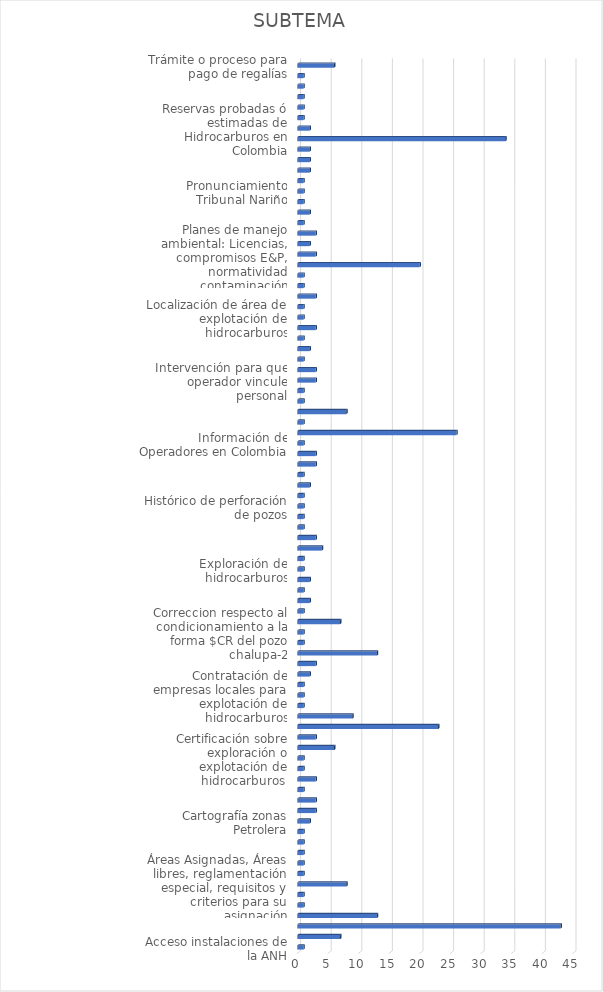
| Category | CANTIDAD |
|---|---|
| Acceso instalaciones de la ANH | 1 |
| Aclaración sobre los TEAs, E&P, Bloques | 7 |
| Acompañamiento a comunidad en desarrollo de proyecto (ambiental, social) | 43 |
| Actividad Hidrocarburífera en regiones del país | 13 |
| Adjudicación de predios baldíos | 1 |
| Archivo tipo shape | 1 |
| Áreas Asignadas, Áreas libres, reglamentación especial, requisitos y criterios para su asignación | 8 |
| Áreas de conservación | 1 |
| Áreas protegidas | 1 |
| Asignación de regalías | 1 |
| Beneficio de población y sus comunidades por actividad petrolera | 1 |
| Caracterización de parque metropolitano | 1 |
| Cartografía zonas Petrolera | 2 |
| Cartografía zonas Petrolera informacion sectorial offshore | 3 |
| Certificacion de asignaciones directas | 3 |
| Certificación de operación | 1 |
| certificacion de presencia de comunidades etnicas | 3 |
| Certificación laboral | 1 |
| Certificación sobre exploración o explotación de hidrocarburos  | 1 |
| Certificado  de trabajo realizado en estado de pozos | 6 |
| Certificado estado de pozos operador Petroantander | 3 |
| Cifras oficiales de producción en el país (producción, precio, demanda, Columnas Estratigráficas | 23 |
| Congreso de la República y Senado  | 9 |
| Consulta Proyecto de Ley Procedimiento Sancionatorio Ambiental | 1 |
| Contratación de empresas locales para explotación de hidrocarburos | 1 |
| Contratos con personal en putumayo | 1 |
| Contratos E&P | 2 |
| Contratos E&P, TEAS y Administrativos | 3 |
| Copias de contratos (E&P, TEAS y Administrativos) | 13 |
| Copias de contratos en el municipio de ovejas sucre | 1 |
| Correccion respecto al condicionamiento a la forma $CR del pozo chalupa-2 | 1 |
| Empresas con pozos en producción o exploración | 7 |
| Estado actual de contrato de hidrocarburos | 1 |
| Estado actual de Pozos | 2 |
| Estado de cumplimiento de contrato | 1 |
| Estudios geofísicos y de sísmica | 2 |
| Exploración de hidrocarburos | 1 |
| Fases de estado de contratos | 1 |
| Fiscalización  | 4 |
| FONADE | 3 |
| Formas de produccion bloque chiguiro | 1 |
| Gestion de cambio crédito BID | 1 |
| Histórico de perforación de pozos | 1 |
| identificacion:de tanques de almacenamiento subterraneo | 1 |
| Impacto y planes de manejo ambiental: Licencias, compromisos E&P normatividad, contaminación | 2 |
| Incoder Titulación de Baldíos  | 1 |
| Inconformidad por desarrollo irregular de proyecto | 3 |
| Información con fines Académicos (tesis de pregrado y postgrado) | 3 |
| Información de Operadores en Colombia | 1 |
| Información del trámite o proceso para pago de regalías | 26 |
| informacion sobre pozos perforados en caqueta | 1 |
| Información y aclaración sobre los TEAs, E&P, Bloques | 8 |
| Informes sobres Consultas previas | 1 |
| Intervención para que compañía pague daños causados o tomar correctivos | 1 |
| Intervención para que operador vincule personal | 3 |
| Intervención por no pago a subcontratistas por parte de Operadoras  | 3 |
| Inversión en exploración y explotación de hidrocarburos | 1 |
| Inversión extranjera en Colombia | 2 |
| Liquidación y pago de regalias | 1 |
| Listas de Elegibles | 3 |
| Localización de área de explotación de hidrocarburos | 1 |
| Mapas de extracción de petróleo | 1 |
| Normatividad sobre exploración, regulación y producción de Hidrocarburos | 3 |
| Operadoras de hidrocarburos | 1 |
| Operadoras, tipo de formaciones, reservas | 1 |
| Otros | 20 |
| Planes de manejo ambiental: Licencias, compromisos E&P, normatividad contaminación | 3 |
| Pozos perforados en Caquetá | 2 |
| Probable existencia de yacimiento Petrolero | 3 |
| Problemas con oleoducto y falta de mantenimiento | 1 |
| problemas en contratos con personal en putumayo | 2 |
| Procesos financieros de la ANH | 1 |
| Pronunciamiento Tribunal Nariño | 1 |
| Quejas en contra de un operador (Perenco) | 1 |
| reglas para contratacion de mano de obra local en municipios de desarrollo E&P | 2 |
| Reliquidación de regalías | 2 |
| Requisitos para la exploración  | 2 |
| Reservas naturales, humedales y comunidades | 34 |
| Reservas probadas ó estimadas de Hidrocarburos en Colombia | 2 |
| Resoluciones que nombran y delegan representantes de la ANH | 1 |
| Sentencias de restitución | 1 |
| Sobretasa a la gasolina | 1 |
| Sondeo de mercado para interventorias  | 1 |
| Sondeo de mercado para interventorias de sismica | 1 |
| Trámite o proceso para pago de regalías | 6 |